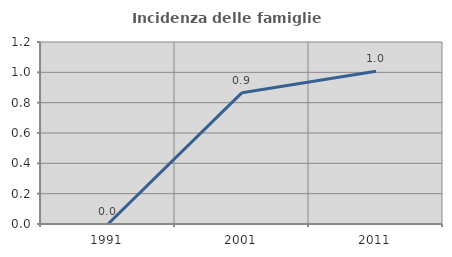
| Category | Incidenza delle famiglie numerose |
|---|---|
| 1991.0 | 0 |
| 2001.0 | 0.866 |
| 2011.0 | 1.007 |